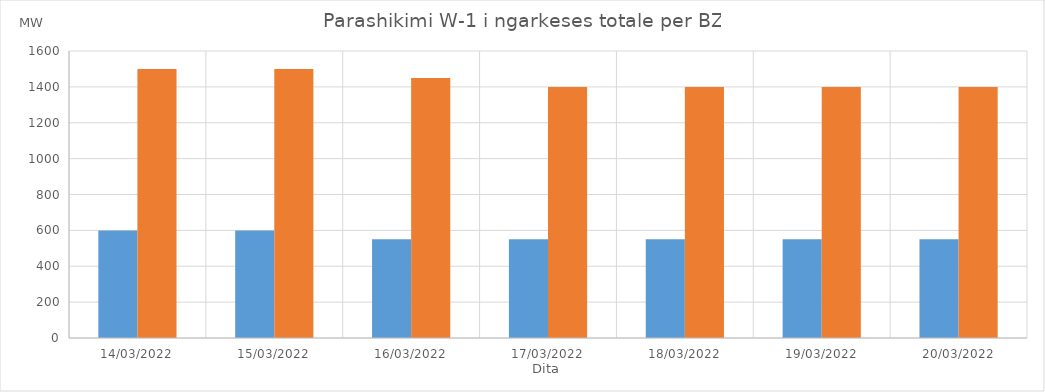
| Category | Min (MW) | Max (MW) |
|---|---|---|
| 14/03/2022 | 600 | 1500 |
| 15/03/2022 | 600 | 1500 |
| 16/03/2022 | 550 | 1450 |
| 17/03/2022 | 550 | 1400 |
| 18/03/2022 | 550 | 1400 |
| 19/03/2022 | 550 | 1400 |
| 20/03/2022 | 550 | 1400 |